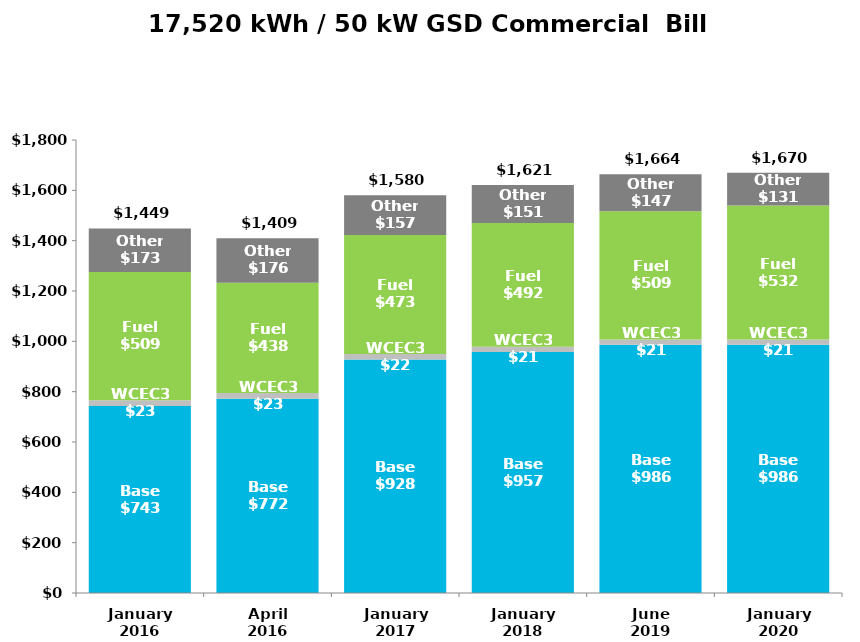
| Category | Base | WCEC3 | Fuel | Other |
|---|---|---|---|---|
| January
2016 | 743.03 | 23 | 509.31 | 173.43 |
| April
2016 | 772.08 | 23 | 438.18 | 175.94 |
| January
2017 | 927.89 | 22 | 473.04 | 157.49 |
| January
2018 | 957.2 | 21 | 492.14 | 151 |
| June
2019 | 986.39 | 21 | 509.13 | 147.4 |
| January
2020 | 986.39 | 21 | 531.91 | 130.82 |